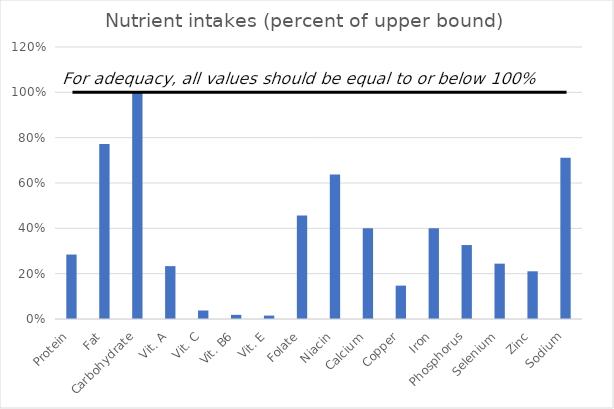
| Category | Series 0 |
|---|---|
| 0 | 0.284 |
| 1 | 0.772 |
| 2 | 1 |
| 3 | 0.233 |
| 4 | 0.038 |
| 5 | 0.018 |
| 6 | 0.015 |
| 7 | 0.457 |
| 8 | 0.637 |
| 9 | 0.4 |
| 10 | 0.147 |
| 11 | 0.4 |
| 12 | 0.326 |
| 13 | 0.244 |
| 14 | 0.21 |
| 15 | 0.711 |